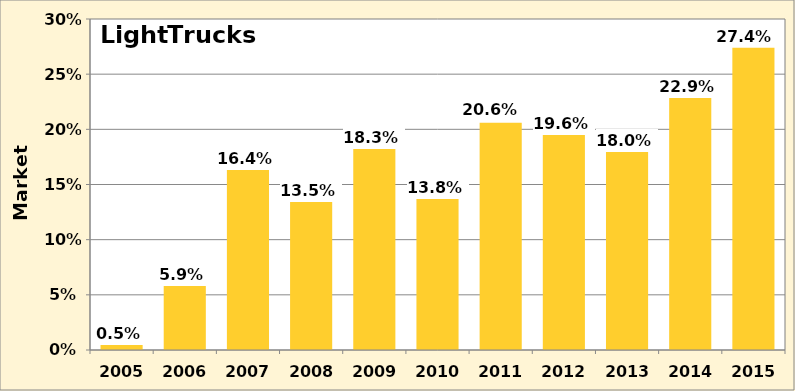
| Category | Series 0 |
|---|---|
| 2005.0 | 0.005 |
| 2006.0 | 0.059 |
| 2007.0 | 0.164 |
| 2008.0 | 0.135 |
| 2009.0 | 0.183 |
| 2010.0 | 0.138 |
| 2011.0 | 0.206 |
| 2012.0 | 0.196 |
| 2013.0 | 0.18 |
| 2014.0 | 0.229 |
| 2015.0 | 0.274 |